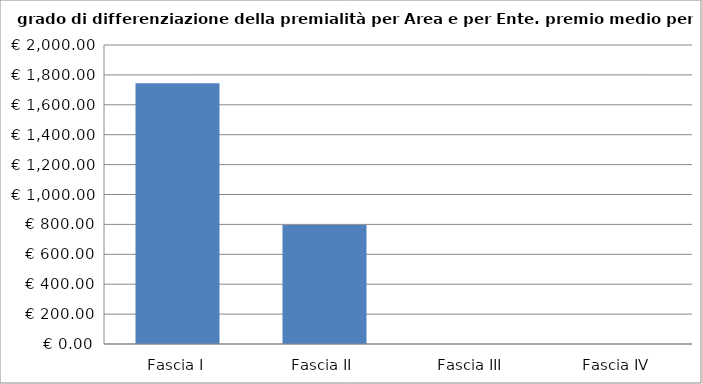
| Category | Totale ente |
|---|---|
| Fascia I | 1743.583 |
| Fascia II | 796.08 |
| Fascia III | 0 |
| Fascia IV | 0 |